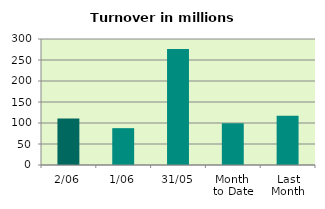
| Category | Series 0 |
|---|---|
| 2/06 | 110.946 |
| 1/06 | 87.725 |
| 31/05 | 276.323 |
| Month 
to Date | 99.335 |
| Last
Month | 117.306 |